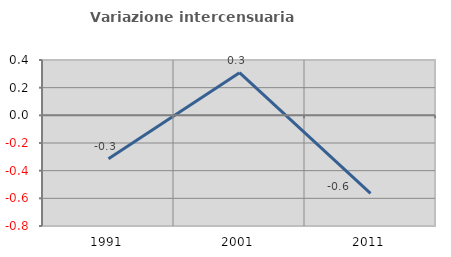
| Category | Variazione intercensuaria annua |
|---|---|
| 1991.0 | -0.315 |
| 2001.0 | 0.309 |
| 2011.0 | -0.565 |